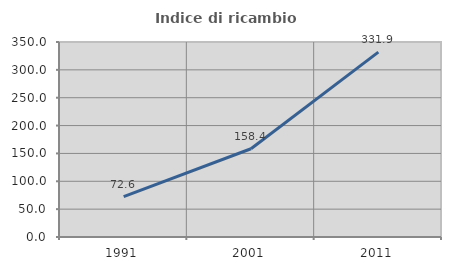
| Category | Indice di ricambio occupazionale  |
|---|---|
| 1991.0 | 72.583 |
| 2001.0 | 158.378 |
| 2011.0 | 331.889 |